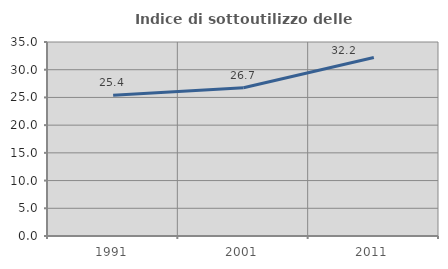
| Category | Indice di sottoutilizzo delle abitazioni  |
|---|---|
| 1991.0 | 25.405 |
| 2001.0 | 26.744 |
| 2011.0 | 32.215 |